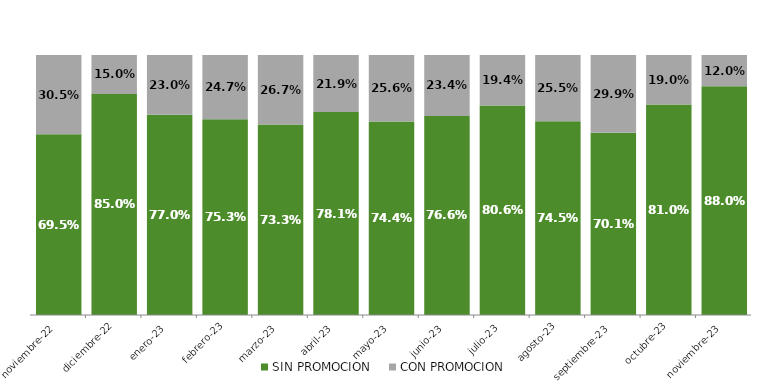
| Category | SIN PROMOCION   | CON PROMOCION   |
|---|---|---|
| 2022-11-01 | 0.695 | 0.305 |
| 2022-12-01 | 0.85 | 0.15 |
| 2023-01-01 | 0.77 | 0.23 |
| 2023-02-01 | 0.753 | 0.247 |
| 2023-03-01 | 0.733 | 0.267 |
| 2023-04-01 | 0.781 | 0.219 |
| 2023-05-01 | 0.744 | 0.256 |
| 2023-06-01 | 0.766 | 0.234 |
| 2023-07-01 | 0.806 | 0.194 |
| 2023-08-01 | 0.745 | 0.255 |
| 2023-09-01 | 0.701 | 0.299 |
| 2023-10-01 | 0.81 | 0.19 |
| 2023-11-01 | 0.88 | 0.12 |